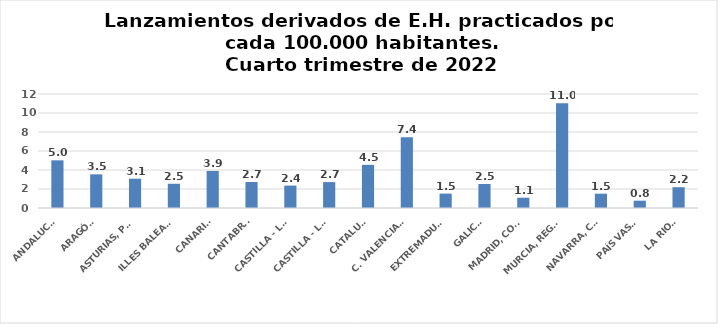
| Category | Series 0 |
|---|---|
| ANDALUCÍA | 5.018 |
| ARAGÓN | 3.544 |
| ASTURIAS, PRINCIPADO | 3.086 |
| ILLES BALEARS | 2.55 |
| CANARIAS | 3.903 |
| CANTABRIA | 2.733 |
| CASTILLA - LEÓN | 2.36 |
| CASTILLA - LA MANCHA | 2.727 |
| CATALUÑA | 4.543 |
| C. VALENCIANA | 7.434 |
| EXTREMADURA | 1.517 |
| GALICIA | 2.527 |
| MADRID, COMUNIDAD | 1.081 |
| MURCIA, REGIÓN | 11.032 |
| NAVARRA, COM. FORAL | 1.506 |
| PAÍS VASCO | 0.77 |
| LA RIOJA | 2.188 |